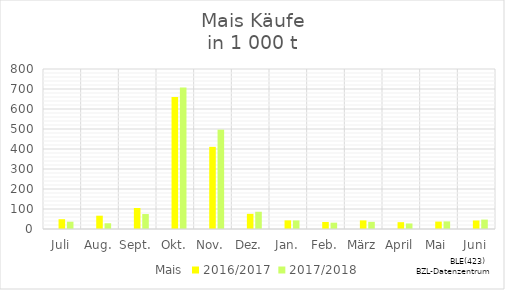
| Category | Mais | 2016/2017 | 2017/2018 |
|---|---|---|---|
| Juli |  | 48.918 | 36.464 |
| Aug. |  | 66.521 | 28.78 |
| Sept. |  | 105.141 | 74.758 |
| Okt. |  | 660.42 | 706.977 |
| Nov. |  | 410.768 | 496.698 |
| Dez. |  | 75.727 | 86.26 |
| Jan. |  | 43.262 | 42.935 |
| Feb. |  | 35.109 | 31.648 |
| März |  | 43.059 | 35.71 |
| April |  | 34.154 | 27.711 |
| Mai |  | 37.015 | 37.964 |
| Juni |  | 42.641 | 47.069 |